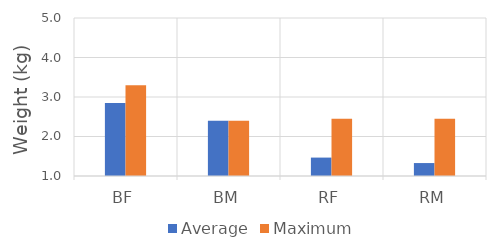
| Category | Average | Maximum |
|---|---|---|
| BF | 2.85 | 3.3 |
| BM | 2.4 | 2.4 |
| RF | 1.466 | 2.45 |
| RM | 1.328 | 2.45 |